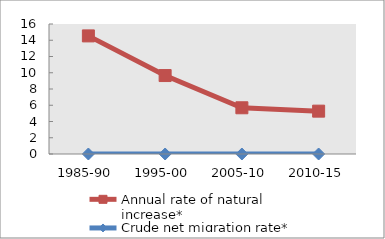
| Category | Annual rate of natural increase* | Crude net migration rate* |
|---|---|---|
| 1985-90 | 14.536 | 0 |
| 1995-00 | 9.654 | 0 |
| 2005-10 | 5.689 | 0 |
| 2010-15 | 5.274 | 0 |